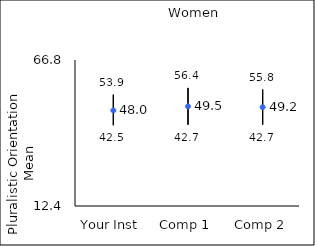
| Category | 25th percentile | 75th percentile | Mean |
|---|---|---|---|
| Your Inst | 42.5 | 53.9 | 48.02 |
| Comp 1 | 42.7 | 56.4 | 49.51 |
| Comp 2 | 42.7 | 55.8 | 49.23 |